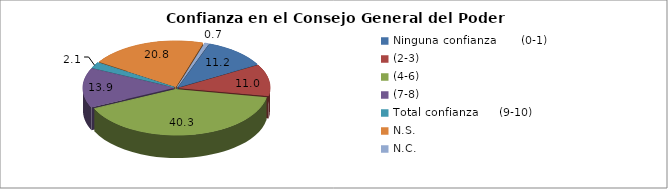
| Category | El Consejo General del Poder Judicial |
|---|---|
| Ninguna confianza      (0-1) | 11.2 |
| (2-3) | 11 |
| (4-6) | 40.3 |
| (7-8) | 13.9 |
| Total confianza     (9-10) | 2.1 |
| N.S. | 20.8 |
| N.C. | 0.7 |